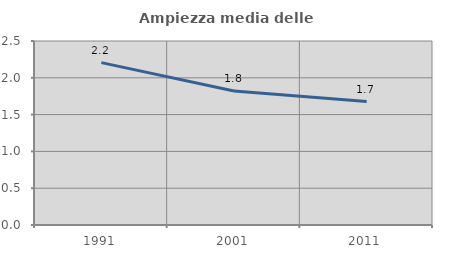
| Category | Ampiezza media delle famiglie |
|---|---|
| 1991.0 | 2.206 |
| 2001.0 | 1.82 |
| 2011.0 | 1.676 |